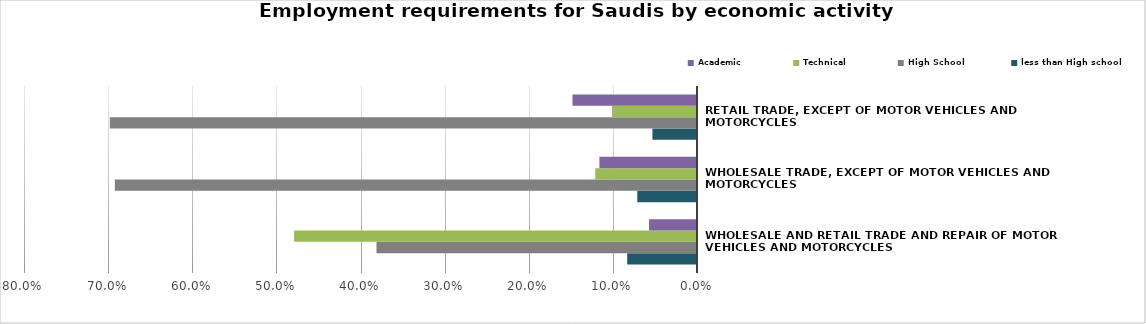
| Category | less than High school | High School | Technical | Academic |
|---|---|---|---|---|
| Wholesale and retail trade and repair of motor vehicles and motorcycles | 0.083 | 0.381 | 0.479 | 0.057 |
| Wholesale trade, except of motor vehicles and motorcycles | 0.071 | 0.692 | 0.121 | 0.116 |
| Retail trade, except of motor vehicles and motorcycles | 0.053 | 0.698 | 0.101 | 0.148 |